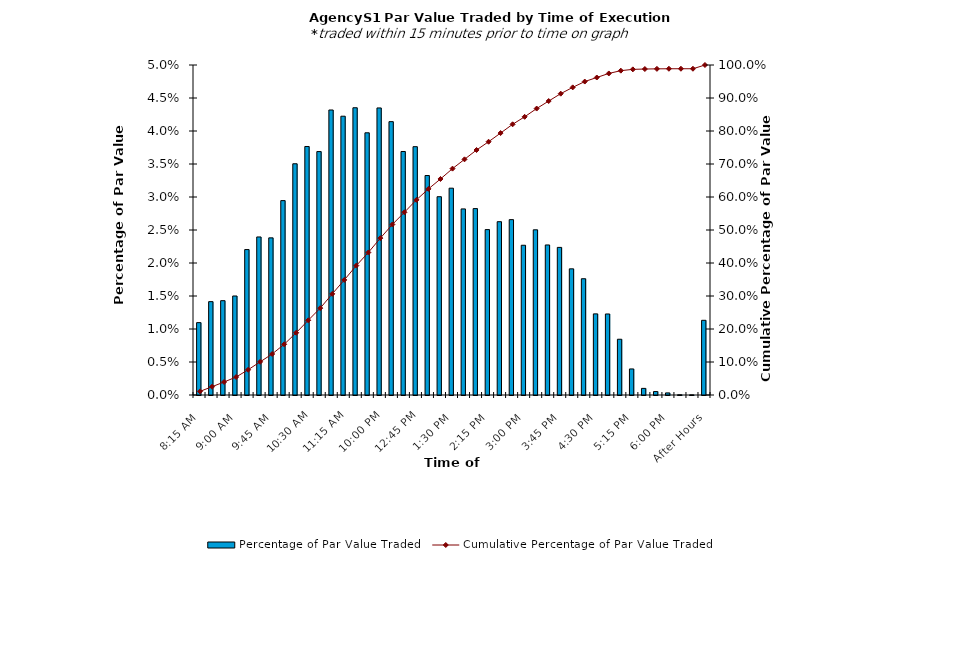
| Category | Percentage of Par Value Traded |
|---|---|
| 8:15 AM | 0.011 |
| 8:30 AM | 0.014 |
| 8:45 AM | 0.014 |
| 9:00 AM | 0.015 |
| 9:15 AM | 0.022 |
| 9:30 AM | 0.024 |
| 9:45 AM | 0.024 |
| 10:00 AM | 0.029 |
| 10:15 AM | 0.035 |
| 10:30 AM | 0.038 |
| 10:45 AM | 0.037 |
| 11:00 AM | 0.043 |
| 11:15 AM | 0.042 |
| 11:30 AM | 0.044 |
| 11:45 AM | 0.04 |
| 12:00 PM | 0.043 |
| 12:15 PM | 0.041 |
| 12:30 PM | 0.037 |
| 12:45 PM | 0.038 |
| 1:00 PM | 0.033 |
| 1:15 PM | 0.03 |
| 1:30 PM | 0.031 |
| 1:45 PM | 0.028 |
| 2:00 PM | 0.028 |
| 2:15 PM | 0.025 |
| 2:30 PM | 0.026 |
| 2:45 PM | 0.027 |
| 3:00 PM | 0.023 |
| 3:15 PM | 0.025 |
| 3:30 PM | 0.023 |
| 3:45 PM | 0.022 |
| 4:00 PM | 0.019 |
| 4:15 PM | 0.018 |
| 4:30 PM | 0.012 |
| 4:45 PM | 0.012 |
| 5:00 PM | 0.008 |
| 5:15 PM | 0.004 |
| 5:30 PM | 0.001 |
| 5:45 PM | 0.001 |
| 6:00 PM | 0 |
| 6:15 PM | 0 |
| 6:30 PM | 0 |
| After Hours | 0.011 |